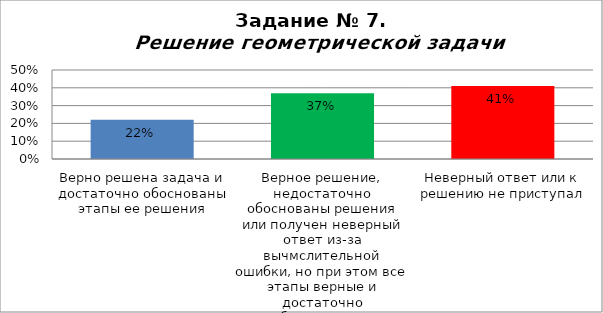
| Category | Решение геометрической задачи  |
|---|---|
| Верно решена задача и достаточно обоснованы этапы ее решения | 0.22 |
| Верное решение, недостаточно обоснованы решения или получен неверный ответ из-за вычмслительной ошибки, но при этом все этапы верные и достаточно обоснованные | 0.37 |
| Неверный ответ или к решению не приступал | 0.41 |